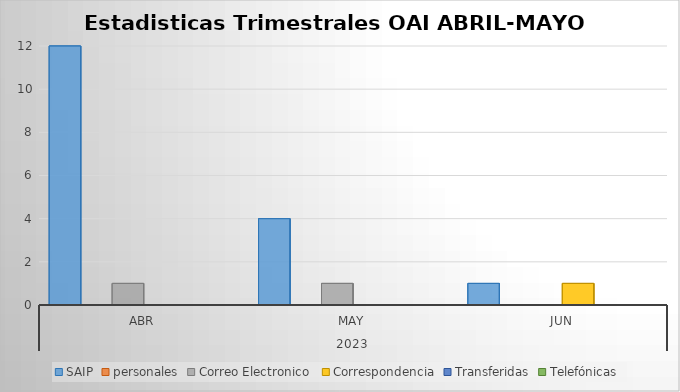
| Category | SAIP | personales | Correo Electronico  | Correspondencia | Transferidas | Telefónicas |
|---|---|---|---|---|---|---|
| 0 | 12 | 0 | 1 | 0 | 0 | 0 |
| 1 | 4 | 0 | 1 | 0 | 0 | 0 |
| 2 | 1 | 0 | 0 | 1 | 0 | 0 |